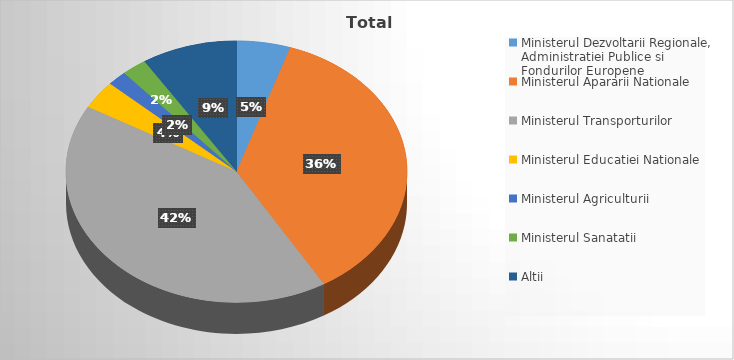
| Category | Series 0 |
|---|---|
| Ministerul Dezvoltarii Regionale, Administratiei Publice si Fondurilor Europene | 5.091 |
| Ministerul Apararii Nationale | 36.359 |
| Ministerul Transporturilor | 41.771 |
| Ministerul Educatiei Nationale | 3.504 |
| Ministerul Agriculturii | 1.845 |
| Ministerul Sanatatii | 2.372 |
| Altii | 9.059 |